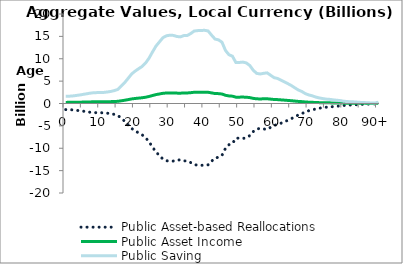
| Category | Public Asset-based Reallocations | Public Asset Income | Public Saving |
|---|---|---|---|
| 0 | -1362.428 | 249.76 | 1612.188 |
|  | -1379.174 | 252.83 | 1632.005 |
| 2 | -1426.299 | 261.469 | 1687.768 |
| 3 | -1515.082 | 277.745 | 1792.827 |
| 4 | -1608.048 | 294.787 | 1902.835 |
| 5 | -1718.044 | 314.952 | 2032.996 |
| 6 | -1829.912 | 335.46 | 2165.372 |
| 7 | -1947.079 | 356.939 | 2304.017 |
| 8 | -2030.479 | 372.227 | 2402.706 |
| 9 | -2057.863 | 377.248 | 2435.111 |
| 10 | -2060.494 | 377.73 | 2438.224 |
| 11 | -2093.56 | 383.792 | 2477.352 |
| 12 | -2176.452 | 398.987 | 2575.439 |
| 13 | -2276.607 | 417.348 | 2693.955 |
| 14 | -2437.932 | 446.922 | 2884.854 |
| 15 | -2659.173 | 487.48 | 3146.652 |
| 16 | -3303.817 | 605.656 | 3909.473 |
| 17 | -3969.14 | 727.623 | 4696.763 |
| 18 | -4770.903 | 874.602 | 5645.505 |
| 19 | -5588.471 | 1024.479 | 6612.949 |
| 20 | -6124.689 | 1122.778 | 7247.467 |
| 21 | -6569.25 | 1204.275 | 7773.525 |
| 22 | -6997.166 | 1282.721 | 8279.887 |
| 23 | -7644.858 | 1401.456 | 9046.314 |
| 24 | -8573.168 | 1571.634 | 10144.802 |
| 25 | -9750.024 | 1787.375 | 11537.398 |
| 26 | -10851.124 | 1989.229 | 12840.353 |
| 27 | -11646.117 | 2134.967 | 13781.083 |
| 28 | -12436.222 | 2279.809 | 14716.031 |
| 29 | -12786.074 | 2343.944 | 15130.018 |
| 30 | -12896.46 | 2364.18 | 15260.64 |
| 31 | -12860.188 | 2357.53 | 15217.719 |
| 32 | -12654.787 | 2319.876 | 14974.664 |
| 33 | -12582.993 | 2306.715 | 14889.707 |
| 34 | -12819.071 | 2349.993 | 15169.064 |
| 35 | -12842.871 | 2354.356 | 15197.227 |
| 36 | -13214.043 | 2422.399 | 15636.442 |
| 37 | -13684.908 | 2508.718 | 16193.626 |
| 38 | -13763.091 | 2523.051 | 16286.142 |
| 39 | -13796.749 | 2529.221 | 16325.969 |
| 40 | -13819.006 | 2533.301 | 16352.307 |
| 41 | -13701.588 | 2511.776 | 16213.364 |
| 42 | -12899.045 | 2364.654 | 15263.699 |
| 43 | -12168.649 | 2230.757 | 14399.407 |
| 44 | -12019.205 | 2203.361 | 14222.567 |
| 45 | -11564.448 | 2119.995 | 13684.443 |
| 46 | -10021.44 | 1837.131 | 11858.57 |
| 47 | -9210.585 | 1688.485 | 10899.07 |
| 48 | -8934.581 | 1637.888 | 10572.469 |
| 49 | -7736.986 | 1418.345 | 9155.33 |
| 50 | -7748.506 | 1420.457 | 9168.963 |
| 51 | -7820.321 | 1433.622 | 9253.942 |
| 52 | -7663.207 | 1404.819 | 9068.027 |
| 53 | -7176.364 | 1315.571 | 8491.935 |
| 54 | -6275.436 | 1150.413 | 7425.849 |
| 55 | -5684.99 | 1042.173 | 6727.162 |
| 56 | -5577.038 | 1022.383 | 6599.421 |
| 57 | -5698.064 | 1044.569 | 6742.633 |
| 58 | -5785.126 | 1060.53 | 6845.656 |
| 59 | -5331.918 | 977.447 | 6309.366 |
| 60 | -4883.453 | 895.235 | 5778.688 |
| 61 | -4722.274 | 865.687 | 5587.961 |
| 62 | -4399.74 | 806.561 | 5206.301 |
| 63 | -4080.809 | 748.094 | 4828.903 |
| 64 | -3735.953 | 684.875 | 4420.828 |
| 65 | -3378.735 | 619.39 | 3998.125 |
| 66 | -2950.739 | 540.93 | 3491.669 |
| 67 | -2544.821 | 466.517 | 3011.338 |
| 68 | -2262.735 | 414.805 | 2677.54 |
| 69 | -1861.251 | 341.205 | 2202.455 |
| 70 | -1616.308 | 296.302 | 1912.61 |
| 71 | -1447.935 | 265.435 | 1713.37 |
| 72 | -1217.59 | 223.209 | 1440.798 |
| 73 | -1050.959 | 192.662 | 1243.62 |
| 74 | -932.098 | 170.872 | 1102.97 |
| 75 | -830.987 | 152.337 | 983.323 |
| 76 | -778.27 | 142.672 | 920.942 |
| 77 | -692.032 | 126.863 | 818.895 |
| 78 | -619.503 | 113.567 | 733.07 |
| 79 | -552.928 | 101.363 | 654.291 |
| 80 | -437.389 | 80.182 | 517.571 |
| 81 | -368.309 | 67.518 | 435.827 |
| 82 | -331.55 | 60.78 | 392.33 |
| 83 | -304.155 | 55.758 | 359.912 |
| 84 | -254.981 | 46.743 | 301.724 |
| 85 | -200.781 | 36.807 | 237.589 |
| 86 | -160.115 | 29.352 | 189.467 |
| 87 | -131.23 | 24.057 | 155.288 |
| 88 | -106.011 | 19.434 | 125.445 |
| 89 | -83.312 | 15.273 | 98.585 |
| 90+ | -237.732 | 43.581 | 281.314 |